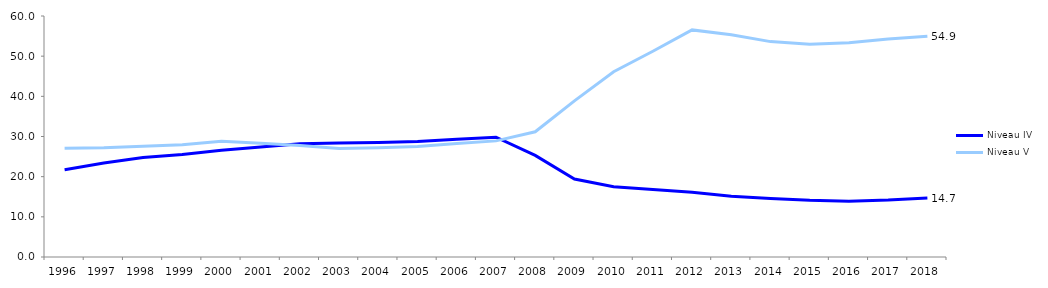
| Category | Niveau IV | Niveau V |
|---|---|---|
| 1996 | 21.718 | 27.088 |
| 1997 | 23.41 | 27.192 |
| 1998 | 24.79 | 27.591 |
| 1999 | 25.546 | 27.963 |
| 2000 | 26.55 | 28.797 |
| 2001 | 27.405 | 28.326 |
| 2002 | 28.216 | 27.76 |
| 2003 | 28.389 | 27.016 |
| 2004 | 28.536 | 27.186 |
| 2005 | 28.732 | 27.507 |
| 2006 | 29.298 | 28.268 |
| 2007 | 29.822 | 28.911 |
| 2008 | 25.292 | 31.184 |
| 2009 | 19.423 | 38.864 |
| 2010 | 17.504 | 46.14 |
| 2011 | 16.812 | 51.224 |
| 2012 | 16.103 | 56.535 |
| 2013 | 15.137 | 55.313 |
| 2014 | 14.583 | 53.621 |
| 2015 | 14.13 | 52.964 |
| 2016 | 13.901 | 53.313 |
| 2017 | 14.164 | 54.267 |
| 2018 | 14.662 | 54.936 |